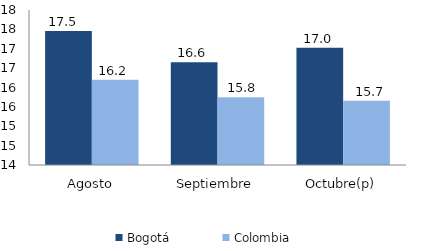
| Category | Bogotá | Colombia |
|---|---|---|
| Agosto | 17.459 | 16.199 |
| Septiembre | 16.649 | 15.751 |
| Octubre(p) | 17.024 | 15.655 |